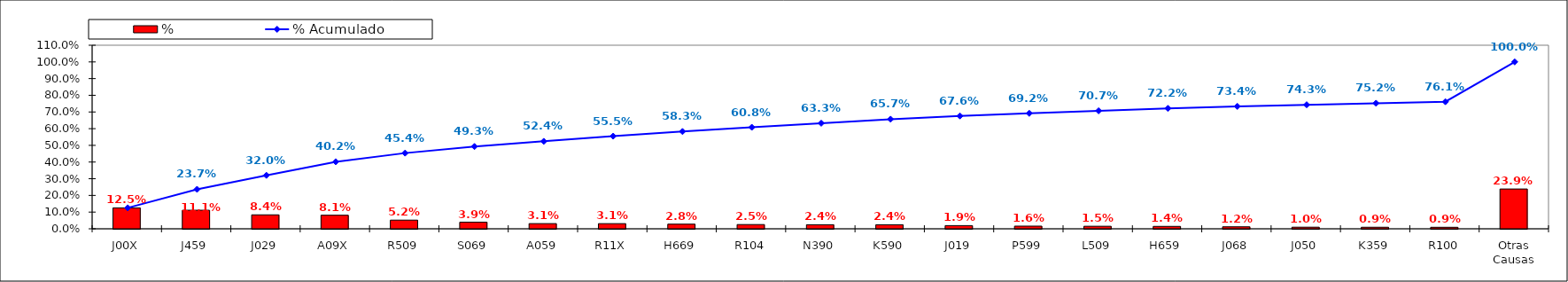
| Category | % |
|---|---|
| J00X | 0.125 |
| J459 | 0.111 |
| J029 | 0.084 |
| A09X | 0.081 |
| R509 | 0.052 |
| S069 | 0.039 |
| A059 | 0.031 |
| R11X | 0.031 |
| H669 | 0.028 |
| R104 | 0.025 |
| N390 | 0.024 |
| K590 | 0.024 |
| J019 | 0.019 |
| P599 | 0.016 |
| L509 | 0.015 |
| H659 | 0.014 |
| J068 | 0.012 |
| J050 | 0.01 |
| K359 | 0.009 |
| R100 | 0.009 |
| Otras Causas | 0.239 |